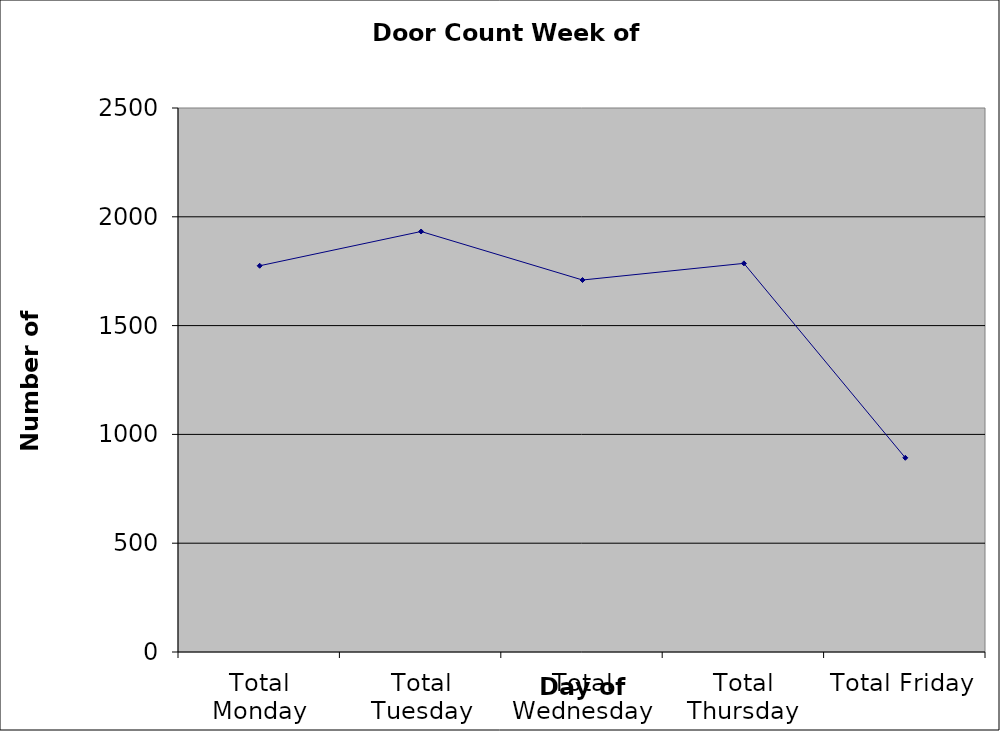
| Category | Series 0 |
|---|---|
| Total Monday | 1775 |
| Total Tuesday | 1932.5 |
| Total Wednesday | 1709.5 |
| Total Thursday | 1786 |
| Total Friday | 892.5 |